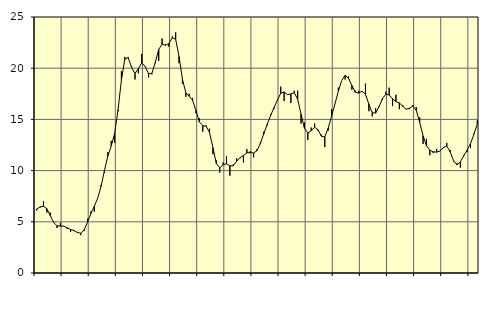
| Category | Piggar | Series 1 |
|---|---|---|
| nan | 6.1 | 6.25 |
| 87.0 | 6.4 | 6.45 |
| 87.0 | 7 | 6.51 |
| 87.0 | 5.9 | 6.27 |
| nan | 5.9 | 5.61 |
| 88.0 | 4.9 | 4.94 |
| 88.0 | 4.4 | 4.61 |
| 88.0 | 4.9 | 4.58 |
| nan | 4.6 | 4.58 |
| 89.0 | 4.3 | 4.41 |
| 89.0 | 4 | 4.25 |
| 89.0 | 4.1 | 4.14 |
| nan | 4 | 3.96 |
| 90.0 | 3.7 | 3.88 |
| 90.0 | 4.1 | 4.2 |
| 90.0 | 5.3 | 4.96 |
| nan | 6 | 5.81 |
| 91.0 | 6 | 6.52 |
| 91.0 | 7.3 | 7.3 |
| 91.0 | 8.6 | 8.46 |
| nan | 9.8 | 10.03 |
| 92.0 | 11.8 | 11.44 |
| 92.0 | 12.9 | 12.4 |
| 92.0 | 12.7 | 13.62 |
| nan | 15.8 | 15.93 |
| 93.0 | 19.7 | 18.86 |
| 93.0 | 21.1 | 20.88 |
| 93.0 | 21.1 | 21.03 |
| nan | 20.2 | 20.07 |
| 94.0 | 18.9 | 19.49 |
| 94.0 | 19.5 | 19.95 |
| 94.0 | 21.4 | 20.51 |
| nan | 20.2 | 20.18 |
| 95.0 | 19.1 | 19.46 |
| 95.0 | 19.4 | 19.5 |
| 95.0 | 20.5 | 20.58 |
| nan | 20.7 | 21.83 |
| 96.0 | 22.9 | 22.34 |
| 96.0 | 22.3 | 22.25 |
| 96.0 | 22.1 | 22.41 |
| nan | 23.1 | 22.97 |
| 97.0 | 23.5 | 22.82 |
| 97.0 | 20.5 | 21.15 |
| 97.0 | 18.5 | 18.92 |
| nan | 17.2 | 17.6 |
| 98.0 | 17.5 | 17.26 |
| 98.0 | 17.1 | 16.85 |
| 98.0 | 15.6 | 15.87 |
| nan | 15.1 | 14.75 |
| 99.0 | 13.8 | 14.39 |
| 99.0 | 14.4 | 14.34 |
| 99.0 | 14.1 | 13.71 |
| nan | 11.6 | 12.24 |
| 0.0 | 11 | 10.7 |
| 0.0 | 9.8 | 10.27 |
| 0.0 | 10.8 | 10.57 |
| nan | 11.4 | 10.67 |
| 1.0 | 9.5 | 10.46 |
| 1.0 | 10.6 | 10.47 |
| 1.0 | 11.2 | 10.92 |
| nan | 11.2 | 11.27 |
| 2.0 | 10.8 | 11.48 |
| 2.0 | 12.1 | 11.72 |
| 2.0 | 11.9 | 11.76 |
| nan | 11.3 | 11.72 |
| 3.0 | 12.1 | 11.95 |
| 3.0 | 12.8 | 12.65 |
| 3.0 | 13.8 | 13.59 |
| nan | 14.4 | 14.5 |
| 4.0 | 15.5 | 15.36 |
| 4.0 | 16 | 16.14 |
| 4.0 | 16.9 | 16.87 |
| nan | 18.2 | 17.55 |
| 5.0 | 16.8 | 17.68 |
| 5.0 | 17.4 | 17.42 |
| 5.0 | 16.6 | 17.48 |
| nan | 17.8 | 17.61 |
| 6.0 | 17.8 | 16.97 |
| 6.0 | 14.6 | 15.5 |
| 6.0 | 14.7 | 14.14 |
| nan | 13 | 13.66 |
| 7.0 | 14.2 | 13.9 |
| 7.0 | 14.6 | 14.23 |
| 7.0 | 13.9 | 13.99 |
| nan | 13.5 | 13.36 |
| 8.0 | 12.3 | 13.29 |
| 8.0 | 13.9 | 14.14 |
| 8.0 | 16 | 15.32 |
| nan | 16.5 | 16.51 |
| 9.0 | 18.1 | 17.75 |
| 9.0 | 18.8 | 18.8 |
| 9.0 | 18.9 | 19.31 |
| nan | 19.2 | 19.01 |
| 10.0 | 17.9 | 18.31 |
| 10.0 | 17.8 | 17.66 |
| 10.0 | 17.8 | 17.57 |
| nan | 17.7 | 17.75 |
| 11.0 | 18.5 | 17.45 |
| 11.0 | 15.8 | 16.49 |
| 11.0 | 15.3 | 15.65 |
| nan | 16.1 | 15.62 |
| 12.0 | 16.3 | 16.24 |
| 12.0 | 16.9 | 17.03 |
| 12.0 | 17.7 | 17.45 |
| nan | 18.1 | 17.39 |
| 13.0 | 16.3 | 17 |
| 13.0 | 17.4 | 16.74 |
| 13.0 | 16 | 16.61 |
| nan | 16.4 | 16.28 |
| 14.0 | 16 | 15.99 |
| 14.0 | 16 | 16.09 |
| 14.0 | 16.4 | 16.31 |
| nan | 16.2 | 15.88 |
| 15.0 | 15.2 | 14.72 |
| 15.0 | 12.6 | 13.4 |
| 15.0 | 13.1 | 12.45 |
| nan | 11.5 | 11.99 |
| 16.0 | 11.7 | 11.84 |
| 16.0 | 12.1 | 11.8 |
| 16.0 | 11.9 | 11.91 |
| nan | 12.2 | 12.26 |
| 17.0 | 12.7 | 12.39 |
| 17.0 | 12 | 11.83 |
| 17.0 | 10.9 | 10.97 |
| nan | 10.7 | 10.56 |
| 18.0 | 10.3 | 10.86 |
| 18.0 | 11.5 | 11.45 |
| 18.0 | 11.8 | 12 |
| nan | 12.2 | 12.63 |
| 19.0 | 13.6 | 13.55 |
| 19.0 | 14.9 | 14.53 |